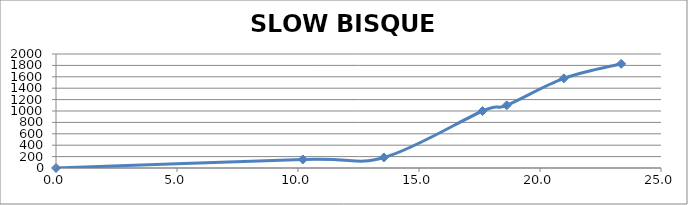
| Category | SLOW BISQUE CHART |
|---|---|
| 0.0 | 0 |
| 10.2 | 150 |
| 13.55 | 185 |
| 17.625 | 1000 |
| 18.625 | 1100 |
| 20.985 | 1572 |
| 23.35537037037037 | 1828 |